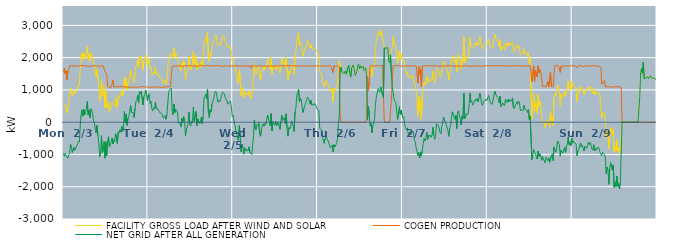
| Category | FACILITY GROSS LOAD AFTER WIND AND SOLAR | COGEN PRODUCTION | NET GRID AFTER ALL GENERATION |
|---|---|---|---|
|  Mon  2/3 | 582 | 1542 | -960 |
|  Mon  2/3 | 608 | 1666 | -1058 |
|  Mon  2/3 | 537 | 1499 | -962 |
|  Mon  2/3 | 560 | 1596 | -1036 |
|  Mon  2/3 | 284 | 1313 | -1029 |
|  Mon  2/3 | 470 | 1590 | -1120 |
|  Mon  2/3 | 611 | 1621 | -1010 |
|  Mon  2/3 | 792 | 1746 | -954 |
|  Mon  2/3 | 1065 | 1750 | -685 |
|  Mon  2/3 | 976 | 1751 | -775 |
|  Mon  2/3 | 803 | 1744 | -941 |
|  Mon  2/3 | 784 | 1738 | -954 |
|  Mon  2/3 | 967 | 1743 | -776 |
|  Mon  2/3 | 872 | 1742 | -870 |
|  Mon  2/3 | 852 | 1751 | -899 |
|  Mon  2/3 | 1005 | 1753 | -748 |
|  Mon  2/3 | 1089 | 1761 | -672 |
|  Mon  2/3 | 1149 | 1737 | -588 |
|  Mon  2/3 | 1116 | 1735 | -619 |
|  Mon  2/3 | 1636 | 1748 | -112 |
|  Mon  2/3 | 1988 | 1749 | 239 |
|  Mon  2/3 | 2149 | 1766 | 383 |
|  Mon  2/3 | 1932 | 1747 | 185 |
|  Mon  2/3 | 2146 | 1743 | 403 |
|  Mon  2/3 | 1973 | 1745 | 228 |
|  Mon  2/3 | 2020 | 1755 | 265 |
|  Mon  2/3 | 2032 | 1749 | 283 |
|  Mon  2/3 | 2367 | 1728 | 639 |
|  Mon  2/3 | 1969 | 1748 | 221 |
|  Mon  2/3 | 2095 | 1721 | 374 |
|  Mon  2/3 | 1886 | 1748 | 138 |
|  Mon  2/3 | 2152 | 1738 | 414 |
|  Mon  2/3 | 2106 | 1739 | 367 |
|  Mon  2/3 | 2009 | 1746 | 263 |
|  Mon  2/3 | 1796 | 1754 | 42 |
|  Mon  2/3 | 1732 | 1746 | -14 |
|  Mon  2/3 | 1529 | 1749 | -220 |
|  Mon  2/3 | 1406 | 1738 | -332 |
|  Mon  2/3 | 1636 | 1731 | -95 |
|  Mon  2/3 | 1338 | 1750 | -412 |
|  Mon  2/3 | 1110 | 1753 | -643 |
|  Mon  2/3 | 654 | 1725 | -1071 |
|  Mon  2/3 | 745 | 1749 | -1004 |
|  Mon  2/3 | 1324 | 1741 | -417 |
|  Mon  2/3 | 787 | 1732 | -945 |
|  Mon  2/3 | 855 | 1748 | -893 |
|  Mon  2/3 | 1140 | 1744 | -604 |
|  Mon  2/3 | 454 | 1570 | -1116 |
|  Mon  2/3 | 945 | 1550 | -605 |
|  Mon  2/3 | 453 | 1487 | -1034 |
|  Mon  2/3 | 524 | 1106 | -582 |
|  Mon  2/3 | 634 | 1085 | -451 |
|  Mon  2/3 | 322 | 1081 | -759 |
|  Mon  2/3 | 429 | 1099 | -670 |
|  Mon  2/3 | 454 | 1087 | -633 |
|  Mon  2/3 | 618 | 1105 | -487 |
|  Mon  2/3 | 623 | 1300 | -677 |
|  Mon  2/3 | 551 | 1096 | -545 |
|  Mon  2/3 | 500 | 1096 | -596 |
|  Mon  2/3 | 739 | 1096 | -357 |
|  Mon  2/3 | 755 | 1088 | -333 |
|  Mon  2/3 | 440 | 1098 | -658 |
|  Mon  2/3 | 799 | 1096 | -297 |
|  Mon  2/3 | 766 | 1094 | -328 |
|  Mon  2/3 | 857 | 1089 | -232 |
|  Mon  2/3 | 805 | 1117 | -312 |
|  Mon  2/3 | 966 | 1102 | -136 |
|  Mon  2/3 | 818 | 1099 | -281 |
|  Mon  2/3 | 983 | 1097 | -114 |
|  Mon  2/3 | 1416 | 1087 | 329 |
|  Mon  2/3 | 1065 | 1092 | -27 |
|  Mon  2/3 | 1349 | 1094 | 255 |
|  Mon  2/3 | 993 | 1092 | -99 |
|  Mon  2/3 | 1214 | 1085 | 129 |
|  Mon  2/3 | 1265 | 1094 | 171 |
|  Mon  2/3 | 1433 | 1080 | 353 |
|  Mon  2/3 | 1616 | 1098 | 518 |
|  Mon  2/3 | 1393 | 1093 | 300 |
|  Mon  2/3 | 1417 | 1100 | 317 |
|  Mon  2/3 | 1380 | 1088 | 292 |
|  Mon  2/3 | 1232 | 1090 | 142 |
|  Mon  2/3 | 1530 | 1091 | 439 |
|  Mon  2/3 | 1741 | 1094 | 647 |
|  Mon  2/3 | 1772 | 1078 | 694 |
|  Mon  2/3 | 1916 | 1091 | 825 |
|  Mon  2/3 | 1691 | 1092 | 599 |
|  Mon  2/3 | 2023 | 1082 | 941 |
|  Mon  2/3 | 1976 | 1099 | 877 |
|  Mon  2/3 | 2057 | 1097 | 960 |
|  Mon  2/3 | 2044 | 1099 | 945 |
|  Mon  2/3 | 1616 | 1080 | 536 |
|  Mon  2/3 | 1880 | 1092 | 788 |
|  Mon  2/3 | 1941 | 1092 | 849 |
|  Mon  2/3 | 2083 | 1092 | 991 |
|  Mon  2/3 | 1956 | 1088 | 868 |
|  Mon  2/3 | 1747 | 1089 | 658 |
|  Tue  2/4 | 1925 | 1088 | 837 |
|  Tue  2/4 | 1968 | 1091 | 877 |
|  Tue  2/4 | 1664 | 1083 | 581 |
|  Tue  2/4 | 1718 | 1076 | 642 |
|  Tue  2/4 | 1518 | 1094 | 424 |
|  Tue  2/4 | 1441 | 1092 | 349 |
|  Tue  2/4 | 1550 | 1100 | 450 |
|  Tue  2/4 | 1499 | 1091 | 408 |
|  Tue  2/4 | 1705 | 1092 | 613 |
|  Tue  2/4 | 1501 | 1087 | 414 |
|  Tue  2/4 | 1476 | 1082 | 394 |
|  Tue  2/4 | 1509 | 1099 | 410 |
|  Tue  2/4 | 1439 | 1096 | 343 |
|  Tue  2/4 | 1375 | 1080 | 295 |
|  Tue  2/4 | 1389 | 1081 | 308 |
|  Tue  2/4 | 1353 | 1076 | 277 |
|  Tue  2/4 | 1330 | 1100 | 230 |
|  Tue  2/4 | 1212 | 1087 | 125 |
|  Tue  2/4 | 1262 | 1098 | 164 |
|  Tue  2/4 | 1300 | 1095 | 205 |
|  Tue  2/4 | 1177 | 1089 | 88 |
|  Tue  2/4 | 1324 | 1095 | 229 |
|  Tue  2/4 | 1654 | 1094 | 560 |
|  Tue  2/4 | 2014 | 1097 | 917 |
|  Tue  2/4 | 2090 | 1096 | 994 |
|  Tue  2/4 | 2113 | 1098 | 1015 |
|  Tue  2/4 | 2144 | 1093 | 1051 |
|  Tue  2/4 | 2065 | 1726 | 339 |
|  Tue  2/4 | 1963 | 1732 | 231 |
|  Tue  2/4 | 2304 | 1742 | 562 |
|  Tue  2/4 | 2033 | 1736 | 297 |
|  Tue  2/4 | 2136 | 1739 | 397 |
|  Tue  2/4 | 2161 | 1756 | 405 |
|  Tue  2/4 | 2056 | 1739 | 317 |
|  Tue  2/4 | 1730 | 1749 | -19 |
|  Tue  2/4 | 1724 | 1750 | -26 |
|  Tue  2/4 | 1713 | 1738 | -25 |
|  Tue  2/4 | 1590 | 1742 | -152 |
|  Tue  2/4 | 1853 | 1737 | 116 |
|  Tue  2/4 | 1710 | 1731 | -21 |
|  Tue  2/4 | 1915 | 1745 | 170 |
|  Tue  2/4 | 1843 | 1740 | 103 |
|  Tue  2/4 | 1316 | 1735 | -419 |
|  Tue  2/4 | 1536 | 1754 | -218 |
|  Tue  2/4 | 1569 | 1735 | -166 |
|  Tue  2/4 | 1700 | 1736 | -36 |
|  Tue  2/4 | 2050 | 1737 | 313 |
|  Tue  2/4 | 1705 | 1757 | -52 |
|  Tue  2/4 | 1626 | 1737 | -111 |
|  Tue  2/4 | 1771 | 1740 | 31 |
|  Tue  2/4 | 1714 | 1736 | -22 |
|  Tue  2/4 | 2200 | 1738 | 462 |
|  Tue  2/4 | 1755 | 1745 | 10 |
|  Tue  2/4 | 1891 | 1751 | 140 |
|  Tue  2/4 | 2070 | 1736 | 334 |
|  Tue  2/4 | 1618 | 1732 | -114 |
|  Tue  2/4 | 1827 | 1725 | 102 |
|  Tue  2/4 | 1856 | 1739 | 117 |
|  Tue  2/4 | 1697 | 1733 | -36 |
|  Tue  2/4 | 1787 | 1766 | 21 |
|  Tue  2/4 | 1901 | 1748 | 153 |
|  Tue  2/4 | 1699 | 1745 | -46 |
|  Tue  2/4 | 1925 | 1748 | 177 |
|  Tue  2/4 | 2486 | 1742 | 744 |
|  Tue  2/4 | 2536 | 1738 | 798 |
|  Tue  2/4 | 2608 | 1745 | 863 |
|  Tue  2/4 | 2470 | 1753 | 717 |
|  Tue  2/4 | 2790 | 1764 | 1026 |
|  Tue  2/4 | 2040 | 1735 | 305 |
|  Tue  2/4 | 1886 | 1742 | 144 |
|  Tue  2/4 | 2127 | 1736 | 391 |
|  Tue  2/4 | 2072 | 1755 | 317 |
|  Tue  2/4 | 2311 | 1749 | 562 |
|  Tue  2/4 | 2295 | 1743 | 552 |
|  Tue  2/4 | 2493 | 1755 | 738 |
|  Tue  2/4 | 2603 | 1737 | 866 |
|  Tue  2/4 | 2707 | 1742 | 965 |
|  Tue  2/4 | 2665 | 1753 | 912 |
|  Tue  2/4 | 2447 | 1732 | 715 |
|  Tue  2/4 | 2370 | 1753 | 617 |
|  Tue  2/4 | 2428 | 1746 | 682 |
|  Tue  2/4 | 2387 | 1747 | 640 |
|  Tue  2/4 | 2475 | 1739 | 736 |
|  Tue  2/4 | 2435 | 1728 | 707 |
|  Tue  2/4 | 2673 | 1745 | 928 |
|  Tue  2/4 | 2692 | 1741 | 951 |
|  Tue  2/4 | 2632 | 1749 | 883 |
|  Tue  2/4 | 2509 | 1742 | 767 |
|  Tue  2/4 | 2504 | 1741 | 763 |
|  Tue  2/4 | 2393 | 1739 | 654 |
|  Tue  2/4 | 2304 | 1746 | 558 |
|  Tue  2/4 | 2279 | 1746 | 533 |
|  Tue  2/4 | 2365 | 1738 | 627 |
|  Tue  2/4 | 2393 | 1733 | 660 |
|  Tue  2/4 | 2221 | 1753 | 468 |
|  Tue  2/4 | 1912 | 1745 | 167 |
|  Wed  2/5 | 1946 | 1737 | 209 |
|  Wed  2/5 | 1918 | 1738 | 180 |
|  Wed  2/5 | 1654 | 1747 | -93 |
|  Wed  2/5 | 1668 | 1754 | -86 |
|  Wed  2/5 | 1382 | 1739 | -357 |
|  Wed  2/5 | 1250 | 1745 | -495 |
|  Wed  2/5 | 1191 | 1750 | -559 |
|  Wed  2/5 | 1637 | 1745 | -108 |
|  Wed  2/5 | 1300 | 1744 | -444 |
|  Wed  2/5 | 822 | 1741 | -919 |
|  Wed  2/5 | 1075 | 1758 | -683 |
|  Wed  2/5 | 965 | 1736 | -771 |
|  Wed  2/5 | 759 | 1750 | -991 |
|  Wed  2/5 | 951 | 1744 | -793 |
|  Wed  2/5 | 943 | 1747 | -804 |
|  Wed  2/5 | 838 | 1739 | -901 |
|  Wed  2/5 | 907 | 1743 | -836 |
|  Wed  2/5 | 849 | 1738 | -889 |
|  Wed  2/5 | 971 | 1731 | -760 |
|  Wed  2/5 | 803 | 1752 | -949 |
|  Wed  2/5 | 717 | 1670 | -953 |
|  Wed  2/5 | 745 | 1753 | -1008 |
|  Wed  2/5 | 1006 | 1745 | -739 |
|  Wed  2/5 | 1336 | 1745 | -409 |
|  Wed  2/5 | 1816 | 1746 | 70 |
|  Wed  2/5 | 1542 | 1750 | -208 |
|  Wed  2/5 | 1489 | 1731 | -242 |
|  Wed  2/5 | 1673 | 1739 | -66 |
|  Wed  2/5 | 1647 | 1754 | -107 |
|  Wed  2/5 | 1725 | 1743 | -18 |
|  Wed  2/5 | 1390 | 1742 | -352 |
|  Wed  2/5 | 1313 | 1750 | -437 |
|  Wed  2/5 | 1524 | 1743 | -219 |
|  Wed  2/5 | 1649 | 1735 | -86 |
|  Wed  2/5 | 1712 | 1762 | -50 |
|  Wed  2/5 | 1607 | 1740 | -133 |
|  Wed  2/5 | 1738 | 1754 | -16 |
|  Wed  2/5 | 1665 | 1738 | -73 |
|  Wed  2/5 | 1644 | 1746 | -102 |
|  Wed  2/5 | 1948 | 1730 | 218 |
|  Wed  2/5 | 1837 | 1738 | 99 |
|  Wed  2/5 | 1809 | 1736 | 73 |
|  Wed  2/5 | 1631 | 1743 | -112 |
|  Wed  2/5 | 2015 | 1748 | 267 |
|  Wed  2/5 | 1467 | 1739 | -272 |
|  Wed  2/5 | 1747 | 1728 | 19 |
|  Wed  2/5 | 1740 | 1747 | -7 |
|  Wed  2/5 | 1644 | 1735 | -91 |
|  Wed  2/5 | 1769 | 1747 | 22 |
|  Wed  2/5 | 1632 | 1747 | -115 |
|  Wed  2/5 | 1662 | 1740 | -78 |
|  Wed  2/5 | 1753 | 1743 | 10 |
|  Wed  2/5 | 1646 | 1759 | -113 |
|  Wed  2/5 | 1525 | 1748 | -223 |
|  Wed  2/5 | 1769 | 1742 | 27 |
|  Wed  2/5 | 1969 | 1751 | 218 |
|  Wed  2/5 | 1805 | 1752 | 53 |
|  Wed  2/5 | 1845 | 1737 | 108 |
|  Wed  2/5 | 1899 | 1754 | 145 |
|  Wed  2/5 | 1703 | 1742 | -39 |
|  Wed  2/5 | 2012 | 1750 | 262 |
|  Wed  2/5 | 1551 | 1755 | -204 |
|  Wed  2/5 | 1306 | 1741 | -435 |
|  Wed  2/5 | 1585 | 1748 | -163 |
|  Wed  2/5 | 1508 | 1725 | -217 |
|  Wed  2/5 | 1603 | 1752 | -149 |
|  Wed  2/5 | 1793 | 1750 | 43 |
|  Wed  2/5 | 1736 | 1741 | -5 |
|  Wed  2/5 | 1770 | 1748 | 22 |
|  Wed  2/5 | 1465 | 1753 | -288 |
|  Wed  2/5 | 2057 | 1731 | 326 |
|  Wed  2/5 | 2186 | 1736 | 450 |
|  Wed  2/5 | 2579 | 1754 | 825 |
|  Wed  2/5 | 2635 | 1732 | 903 |
|  Wed  2/5 | 2776 | 1752 | 1024 |
|  Wed  2/5 | 2382 | 1746 | 636 |
|  Wed  2/5 | 2477 | 1738 | 739 |
|  Wed  2/5 | 2444 | 1750 | 694 |
|  Wed  2/5 | 2425 | 1750 | 675 |
|  Wed  2/5 | 2039 | 1738 | 301 |
|  Wed  2/5 | 2152 | 1740 | 412 |
|  Wed  2/5 | 2270 | 1750 | 520 |
|  Wed  2/5 | 2330 | 1746 | 584 |
|  Wed  2/5 | 2402 | 1736 | 666 |
|  Wed  2/5 | 2529 | 1748 | 781 |
|  Wed  2/5 | 2555 | 1746 | 809 |
|  Wed  2/5 | 2414 | 1729 | 685 |
|  Wed  2/5 | 2294 | 1735 | 559 |
|  Wed  2/5 | 2405 | 1732 | 673 |
|  Wed  2/5 | 2293 | 1757 | 536 |
|  Wed  2/5 | 2253 | 1732 | 521 |
|  Wed  2/5 | 2268 | 1740 | 528 |
|  Wed  2/5 | 2304 | 1724 | 580 |
|  Wed  2/5 | 2334 | 1738 | 596 |
|  Wed  2/5 | 2242 | 1752 | 490 |
|  Wed  2/5 | 2156 | 1745 | 411 |
|  Thu  2/6 | 2158 | 1741 | 417 |
|  Thu  2/6 | 2085 | 1743 | 342 |
|  Thu  2/6 | 1562 | 1759 | -197 |
|  Thu  2/6 | 1548 | 1745 | -197 |
|  Thu  2/6 | 1508 | 1746 | -238 |
|  Thu  2/6 | 1271 | 1739 | -468 |
|  Thu  2/6 | 1287 | 1731 | -444 |
|  Thu  2/6 | 1088 | 1743 | -655 |
|  Thu  2/6 | 1221 | 1743 | -522 |
|  Thu  2/6 | 1288 | 1741 | -453 |
|  Thu  2/6 | 1242 | 1736 | -494 |
|  Thu  2/6 | 1223 | 1736 | -513 |
|  Thu  2/6 | 1131 | 1743 | -612 |
|  Thu  2/6 | 1037 | 1756 | -719 |
|  Thu  2/6 | 954 | 1746 | -792 |
|  Thu  2/6 | 947 | 1735 | -788 |
|  Thu  2/6 | 1034 | 1740 | -706 |
|  Thu  2/6 | 615 | 1538 | -923 |
|  Thu  2/6 | 1049 | 1747 | -698 |
|  Thu  2/6 | 965 | 1735 | -770 |
|  Thu  2/6 | 981 | 1731 | -750 |
|  Thu  2/6 | 1072 | 1733 | -661 |
|  Thu  2/6 | 1225 | 1747 | -522 |
|  Thu  2/6 | 1670 | 1746 | -76 |
|  Thu  2/6 | 1900 | 1730 | 170 |
|  Thu  2/6 | 1796 | 214 | 1582 |
|  Thu  2/6 | 1700 | 0 | 1700 |
|  Thu  2/6 | 1554 | 0 | 1554 |
|  Thu  2/6 | 1578 | 0 | 1578 |
|  Thu  2/6 | 1492 | 0 | 1492 |
|  Thu  2/6 | 1483 | 0 | 1483 |
|  Thu  2/6 | 1589 | 0 | 1589 |
|  Thu  2/6 | 1481 | 0 | 1481 |
|  Thu  2/6 | 1471 | 0 | 1471 |
|  Thu  2/6 | 1712 | 0 | 1712 |
|  Thu  2/6 | 1770 | 0 | 1770 |
|  Thu  2/6 | 1490 | 0 | 1490 |
|  Thu  2/6 | 1396 | 0 | 1396 |
|  Thu  2/6 | 1676 | 0 | 1676 |
|  Thu  2/6 | 1652 | 0 | 1652 |
|  Thu  2/6 | 1776 | 0 | 1776 |
|  Thu  2/6 | 1636 | 0 | 1636 |
|  Thu  2/6 | 1448 | 0 | 1448 |
|  Thu  2/6 | 1474 | 0 | 1474 |
|  Thu  2/6 | 1562 | 0 | 1562 |
|  Thu  2/6 | 1750 | 0 | 1750 |
|  Thu  2/6 | 1802 | 0 | 1802 |
|  Thu  2/6 | 1648 | 0 | 1648 |
|  Thu  2/6 | 1748 | 0 | 1748 |
|  Thu  2/6 | 1685 | 0 | 1685 |
|  Thu  2/6 | 1697 | 0 | 1697 |
|  Thu  2/6 | 1730 | 0 | 1730 |
|  Thu  2/6 | 1598 | 0 | 1598 |
|  Thu  2/6 | 1633 | 0 | 1633 |
|  Thu  2/6 | 1687 | 0 | 1687 |
|  Thu  2/6 | 1596 | 148 | 1448 |
|  Thu  2/6 | 1495 | 1430 | 65 |
|  Thu  2/6 | 1478 | 985 | 493 |
|  Thu  2/6 | 1444 | 1250 | 194 |
|  Thu  2/6 | 1633 | 1739 | -106 |
|  Thu  2/6 | 1717 | 1751 | -34 |
|  Thu  2/6 | 1416 | 1748 | -332 |
|  Thu  2/6 | 1642 | 1750 | -108 |
|  Thu  2/6 | 1707 | 1742 | -35 |
|  Thu  2/6 | 1892 | 1765 | 127 |
|  Thu  2/6 | 2318 | 1742 | 576 |
|  Thu  2/6 | 2518 | 1748 | 770 |
|  Thu  2/6 | 2534 | 1754 | 780 |
|  Thu  2/6 | 2806 | 1764 | 1042 |
|  Thu  2/6 | 2769 | 1739 | 1030 |
|  Thu  2/6 | 2669 | 1741 | 928 |
|  Thu  2/6 | 2846 | 1754 | 1092 |
|  Thu  2/6 | 2831 | 1727 | 1104 |
|  Thu  2/6 | 2606 | 1758 | 848 |
|  Thu  2/6 | 2486 | 1734 | 752 |
|  Thu  2/6 | 2300 | 0 | 2300 |
|  Thu  2/6 | 2300 | 0 | 2300 |
|  Thu  2/6 | 2300 | 0 | 2300 |
|  Thu  2/6 | 2300 | 0 | 2300 |
|  Thu  2/6 | 2300 | 0 | 2300 |
|  Thu  2/6 | 1896 | 0 | 1896 |
|  Thu  2/6 | 1846 | 0 | 1846 |
|  Thu  2/6 | 2089 | 0 | 2089 |
|  Thu  2/6 | 2208 | 691 | 1517 |
|  Thu  2/6 | 2321 | 1241 | 1080 |
|  Thu  2/6 | 2663 | 1746 | 917 |
|  Thu  2/6 | 2427 | 1731 | 696 |
|  Thu  2/6 | 2423 | 1751 | 672 |
|  Thu  2/6 | 2345 | 1738 | 607 |
|  Thu  2/6 | 2117 | 1748 | 369 |
|  Thu  2/6 | 1824 | 1738 | 86 |
|  Thu  2/6 | 2011 | 1760 | 251 |
|  Thu  2/6 | 2215 | 1735 | 480 |
|  Thu  2/6 | 1997 | 1749 | 248 |
|  Thu  2/6 | 2116 | 1743 | 373 |
|  Thu  2/6 | 1964 | 1734 | 230 |
|  Fri  2/7 | 1870 | 1738 | 132 |
|  Fri  2/7 | 1913 | 1743 | 170 |
|  Fri  2/7 | 1679 | 1754 | -75 |
|  Fri  2/7 | 1572 | 1736 | -164 |
|  Fri  2/7 | 1501 | 1737 | -236 |
|  Fri  2/7 | 1568 | 1746 | -178 |
|  Fri  2/7 | 1380 | 1734 | -354 |
|  Fri  2/7 | 1407 | 1748 | -341 |
|  Fri  2/7 | 1445 | 1758 | -313 |
|  Fri  2/7 | 1353 | 1744 | -391 |
|  Fri  2/7 | 1421 | 1737 | -316 |
|  Fri  2/7 | 1446 | 1746 | -300 |
|  Fri  2/7 | 1442 | 1742 | -300 |
|  Fri  2/7 | 1183 | 1738 | -555 |
|  Fri  2/7 | 1143 | 1748 | -605 |
|  Fri  2/7 | 964 | 1753 | -789 |
|  Fri  2/7 | 953 | 1748 | -795 |
|  Fri  2/7 | 179 | 1210 | -1031 |
|  Fri  2/7 | 797 | 1735 | -938 |
|  Fri  2/7 | 372 | 1482 | -1110 |
|  Fri  2/7 | 688 | 1633 | -945 |
|  Fri  2/7 | 61 | 1091 | -1030 |
|  Fri  2/7 | 862 | 1741 | -879 |
|  Fri  2/7 | 1071 | 1741 | -670 |
|  Fri  2/7 | 1247 | 1752 | -505 |
|  Fri  2/7 | 1155 | 1736 | -581 |
|  Fri  2/7 | 1248 | 1754 | -506 |
|  Fri  2/7 | 1430 | 1743 | -313 |
|  Fri  2/7 | 1214 | 1746 | -532 |
|  Fri  2/7 | 1344 | 1747 | -403 |
|  Fri  2/7 | 1308 | 1746 | -438 |
|  Fri  2/7 | 1336 | 1735 | -399 |
|  Fri  2/7 | 1278 | 1747 | -469 |
|  Fri  2/7 | 1348 | 1751 | -403 |
|  Fri  2/7 | 1584 | 1740 | -156 |
|  Fri  2/7 | 1345 | 1754 | -409 |
|  Fri  2/7 | 1222 | 1752 | -530 |
|  Fri  2/7 | 1299 | 1744 | -445 |
|  Fri  2/7 | 1688 | 1735 | -47 |
|  Fri  2/7 | 1689 | 1757 | -68 |
|  Fri  2/7 | 1626 | 1733 | -107 |
|  Fri  2/7 | 1547 | 1730 | -183 |
|  Fri  2/7 | 1421 | 1740 | -319 |
|  Fri  2/7 | 1382 | 1746 | -364 |
|  Fri  2/7 | 1589 | 1736 | -147 |
|  Fri  2/7 | 1728 | 1742 | -14 |
|  Fri  2/7 | 1898 | 1742 | 156 |
|  Fri  2/7 | 1800 | 1730 | 70 |
|  Fri  2/7 | 1783 | 1729 | 54 |
|  Fri  2/7 | 1681 | 1747 | -66 |
|  Fri  2/7 | 1660 | 1754 | -94 |
|  Fri  2/7 | 1484 | 1745 | -261 |
|  Fri  2/7 | 1316 | 1755 | -439 |
|  Fri  2/7 | 1569 | 1749 | -180 |
|  Fri  2/7 | 1643 | 1747 | -104 |
|  Fri  2/7 | 1863 | 1744 | 119 |
|  Fri  2/7 | 2062 | 1741 | 321 |
|  Fri  2/7 | 1986 | 1742 | 244 |
|  Fri  2/7 | 1987 | 1733 | 254 |
|  Fri  2/7 | 1835 | 1751 | 84 |
|  Fri  2/7 | 1951 | 1740 | 211 |
|  Fri  2/7 | 1556 | 1753 | -197 |
|  Fri  2/7 | 2060 | 1744 | 316 |
|  Fri  2/7 | 2101 | 1745 | 356 |
|  Fri  2/7 | 1982 | 1747 | 235 |
|  Fri  2/7 | 1830 | 1754 | 76 |
|  Fri  2/7 | 1643 | 1730 | -87 |
|  Fri  2/7 | 1945 | 1755 | 190 |
|  Fri  2/7 | 1842 | 1741 | 101 |
|  Fri  2/7 | 2644 | 1746 | 898 |
|  Fri  2/7 | 1854 | 1742 | 112 |
|  Fri  2/7 | 1914 | 1746 | 168 |
|  Fri  2/7 | 2029 | 1756 | 273 |
|  Fri  2/7 | 1966 | 1741 | 225 |
|  Fri  2/7 | 2030 | 1743 | 287 |
|  Fri  2/7 | 2327 | 1753 | 574 |
|  Fri  2/7 | 2633 | 1734 | 899 |
|  Fri  2/7 | 2361 | 1744 | 617 |
|  Fri  2/7 | 2390 | 1736 | 654 |
|  Fri  2/7 | 2281 | 1754 | 527 |
|  Fri  2/7 | 2304 | 1735 | 569 |
|  Fri  2/7 | 2337 | 1744 | 593 |
|  Fri  2/7 | 2446 | 1742 | 704 |
|  Fri  2/7 | 2388 | 1729 | 659 |
|  Fri  2/7 | 2477 | 1739 | 738 |
|  Fri  2/7 | 2364 | 1738 | 626 |
|  Fri  2/7 | 2446 | 1737 | 709 |
|  Fri  2/7 | 2651 | 1747 | 904 |
|  Fri  2/7 | 2512 | 1736 | 776 |
|  Fri  2/7 | 2328 | 1748 | 580 |
|  Fri  2/7 | 2261 | 1736 | 525 |
|  Fri  2/7 | 2376 | 1745 | 631 |
|  Fri  2/7 | 2373 | 1754 | 619 |
|  Fri  2/7 | 2406 | 1737 | 669 |
|  Fri  2/7 | 2466 | 1749 | 717 |
|  Fri  2/7 | 2423 | 1752 | 671 |
|  Sat  2/8 | 2420 | 1740 | 680 |
|  Sat  2/8 | 2575 | 1745 | 830 |
|  Sat  2/8 | 2559 | 1749 | 810 |
|  Sat  2/8 | 2330 | 1738 | 592 |
|  Sat  2/8 | 2323 | 1754 | 569 |
|  Sat  2/8 | 2289 | 1735 | 554 |
|  Sat  2/8 | 2419 | 1734 | 685 |
|  Sat  2/8 | 2398 | 1725 | 673 |
|  Sat  2/8 | 2712 | 1753 | 959 |
|  Sat  2/8 | 2624 | 1757 | 867 |
|  Sat  2/8 | 2564 | 1751 | 813 |
|  Sat  2/8 | 2536 | 1738 | 798 |
|  Sat  2/8 | 2478 | 1742 | 736 |
|  Sat  2/8 | 2331 | 1731 | 600 |
|  Sat  2/8 | 2556 | 1752 | 804 |
|  Sat  2/8 | 2231 | 1748 | 483 |
|  Sat  2/8 | 2251 | 1751 | 500 |
|  Sat  2/8 | 2352 | 1757 | 595 |
|  Sat  2/8 | 2309 | 1743 | 566 |
|  Sat  2/8 | 2243 | 1742 | 501 |
|  Sat  2/8 | 2449 | 1743 | 706 |
|  Sat  2/8 | 2377 | 1738 | 639 |
|  Sat  2/8 | 2341 | 1736 | 605 |
|  Sat  2/8 | 2479 | 1763 | 716 |
|  Sat  2/8 | 2367 | 1741 | 626 |
|  Sat  2/8 | 2447 | 1749 | 698 |
|  Sat  2/8 | 2399 | 1756 | 643 |
|  Sat  2/8 | 2425 | 1738 | 687 |
|  Sat  2/8 | 2491 | 1737 | 754 |
|  Sat  2/8 | 2227 | 1757 | 470 |
|  Sat  2/8 | 2163 | 1745 | 418 |
|  Sat  2/8 | 2170 | 1735 | 435 |
|  Sat  2/8 | 2319 | 1750 | 569 |
|  Sat  2/8 | 2384 | 1749 | 635 |
|  Sat  2/8 | 2292 | 1739 | 553 |
|  Sat  2/8 | 2370 | 1722 | 648 |
|  Sat  2/8 | 2331 | 1756 | 575 |
|  Sat  2/8 | 2086 | 1737 | 349 |
|  Sat  2/8 | 2125 | 1742 | 383 |
|  Sat  2/8 | 2130 | 1752 | 378 |
|  Sat  2/8 | 2106 | 1750 | 356 |
|  Sat  2/8 | 2272 | 1750 | 522 |
|  Sat  2/8 | 2147 | 1733 | 414 |
|  Sat  2/8 | 2179 | 1754 | 425 |
|  Sat  2/8 | 2114 | 1747 | 367 |
|  Sat  2/8 | 2034 | 1736 | 298 |
|  Sat  2/8 | 2145 | 1740 | 405 |
|  Sat  2/8 | 1825 | 1734 | 91 |
|  Sat  2/8 | 1946 | 1757 | 189 |
|  Sat  2/8 | 1953 | 1740 | 213 |
|  Sat  2/8 | 100 | 1262 | -1162 |
|  Sat  2/8 | 588 | 1580 | -992 |
|  Sat  2/8 | 898 | 1745 | -847 |
|  Sat  2/8 | 333 | 1255 | -922 |
|  Sat  2/8 | 622 | 1596 | -974 |
|  Sat  2/8 | 499 | 1569 | -1070 |
|  Sat  2/8 | 263 | 1406 | -1143 |
|  Sat  2/8 | 858 | 1750 | -892 |
|  Sat  2/8 | 470 | 1533 | -1063 |
|  Sat  2/8 | 655 | 1637 | -982 |
|  Sat  2/8 | 515 | 1541 | -1026 |
|  Sat  2/8 | 189 | 1372 | -1183 |
|  Sat  2/8 | 33 | 1105 | -1072 |
|  Sat  2/8 | -32 | 1105 | -1137 |
|  Sat  2/8 | 2 | 1110 | -1108 |
|  Sat  2/8 | -164 | 1096 | -1260 |
|  Sat  2/8 | 9 | 1090 | -1081 |
|  Sat  2/8 | 3 | 1098 | -1095 |
|  Sat  2/8 | 64 | 1257 | -1193 |
|  Sat  2/8 | -16 | 1091 | -1107 |
|  Sat  2/8 | -155 | 1088 | -1243 |
|  Sat  2/8 | 333 | 1554 | -1221 |
|  Sat  2/8 | 58 | 1099 | -1041 |
|  Sat  2/8 | 143 | 1128 | -985 |
|  Sat  2/8 | -101 | 1093 | -1194 |
|  Sat  2/8 | 738 | 1505 | -767 |
|  Sat  2/8 | 889 | 1753 | -864 |
|  Sat  2/8 | 814 | 1744 | -930 |
|  Sat  2/8 | 924 | 1757 | -833 |
|  Sat  2/8 | 1162 | 1743 | -581 |
|  Sat  2/8 | 1089 | 1748 | -659 |
|  Sat  2/8 | 1043 | 1734 | -691 |
|  Sat  2/8 | 488 | 1540 | -1052 |
|  Sat  2/8 | 875 | 1734 | -859 |
|  Sat  2/8 | 890 | 1741 | -851 |
|  Sat  2/8 | 770 | 1729 | -959 |
|  Sat  2/8 | 800 | 1746 | -946 |
|  Sat  2/8 | 958 | 1742 | -784 |
|  Sat  2/8 | 804 | 1733 | -929 |
|  Sat  2/8 | 992 | 1743 | -751 |
|  Sat  2/8 | 1045 | 1744 | -699 |
|  Sat  2/8 | 1283 | 1746 | -463 |
|  Sat  2/8 | 1040 | 1734 | -694 |
|  Sat  2/8 | 1118 | 1742 | -624 |
|  Sat  2/8 | 984 | 1724 | -740 |
|  Sat  2/8 | 1263 | 1752 | -489 |
|  Sun  2/9 | 1103 | 1753 | -650 |
|  Sun  2/9 | 1159 | 1749 | -590 |
|  Sun  2/9 | 1103 | 1749 | -646 |
|  Sun  2/9 | 1089 | 1738 | -649 |
|  Sun  2/9 | 1077 | 1751 | -674 |
|  Sun  2/9 | 639 | 1678 | -1039 |
|  Sun  2/9 | 850 | 1742 | -892 |
|  Sun  2/9 | 903 | 1755 | -852 |
|  Sun  2/9 | 896 | 1755 | -859 |
|  Sun  2/9 | 1113 | 1757 | -644 |
|  Sun  2/9 | 981 | 1738 | -757 |
|  Sun  2/9 | 1018 | 1737 | -719 |
|  Sun  2/9 | 984 | 1727 | -743 |
|  Sun  2/9 | 843 | 1735 | -892 |
|  Sun  2/9 | 988 | 1737 | -749 |
|  Sun  2/9 | 983 | 1751 | -768 |
|  Sun  2/9 | 943 | 1758 | -815 |
|  Sun  2/9 | 951 | 1753 | -802 |
|  Sun  2/9 | 1119 | 1736 | -617 |
|  Sun  2/9 | 1027 | 1721 | -694 |
|  Sun  2/9 | 1111 | 1738 | -627 |
|  Sun  2/9 | 1022 | 1745 | -723 |
|  Sun  2/9 | 913 | 1749 | -836 |
|  Sun  2/9 | 875 | 1748 | -873 |
|  Sun  2/9 | 1048 | 1745 | -697 |
|  Sun  2/9 | 843 | 1732 | -889 |
|  Sun  2/9 | 935 | 1747 | -812 |
|  Sun  2/9 | 869 | 1733 | -864 |
|  Sun  2/9 | 943 | 1741 | -798 |
|  Sun  2/9 | 957 | 1723 | -766 |
|  Sun  2/9 | 897 | 1725 | -828 |
|  Sun  2/9 | 806 | 1735 | -929 |
|  Sun  2/9 | 783 | 1696 | -913 |
|  Sun  2/9 | 130 | 1171 | -1041 |
|  Sun  2/9 | 286 | 1219 | -933 |
|  Sun  2/9 | 299 | 1215 | -916 |
|  Sun  2/9 | 294 | 1289 | -995 |
|  Sun  2/9 | 23 | 1097 | -1074 |
|  Sun  2/9 | -496 | 1097 | -1593 |
|  Sun  2/9 | -294 | 1097 | -1391 |
|  Sun  2/9 | -372 | 1102 | -1474 |
|  Sun  2/9 | -826 | 1098 | -1924 |
|  Sun  2/9 | -339 | 1099 | -1438 |
|  Sun  2/9 | -161 | 1088 | -1249 |
|  Sun  2/9 | -304 | 1088 | -1392 |
|  Sun  2/9 | -405 | 1084 | -1489 |
|  Sun  2/9 | -225 | 1100 | -1325 |
|  Sun  2/9 | -925 | 1094 | -2019 |
|  Sun  2/9 | -764 | 1091 | -1855 |
|  Sun  2/9 | -895 | 1100 | -1995 |
|  Sun  2/9 | -565 | 1102 | -1667 |
|  Sun  2/9 | -892 | 1094 | -1986 |
|  Sun  2/9 | -789 | 1091 | -1880 |
|  Sun  2/9 | -967 | 1099 | -2066 |
|  Sun  2/9 | -815 | 1085 | -1900 |
|  Sun  2/9 | -815 | 1085 | -1900 |
|  Sun  2/9 | 0 | 0 | 0 |
|  Sun  2/9 | 0 | 0 | 0 |
|  Sun  2/9 | 0 | 0 | 0 |
|  Sun  2/9 | 0 | 0 | 0 |
|  Sun  2/9 | 0 | 0 | 0 |
|  Sun  2/9 | 0 | 0 | 0 |
|  Sun  2/9 | 0 | 0 | 0 |
|  Sun  2/9 | 0 | 0 | 0 |
|  Sun  2/9 | 0 | 0 | 0 |
|  Sun  2/9 | 0 | 0 | 0 |
|  Sun  2/9 | 0 | 0 | 0 |
|  Sun  2/9 | 0 | 0 | 0 |
|  Sun  2/9 | 0 | 0 | 0 |
|  Sun  2/9 | 0 | 0 | 0 |
|  Sun  2/9 | 0 | 0 | 0 |
|  Sun  2/9 | 0 | 0 | 0 |
|  Sun  2/9 | 0 | 0 | 0 |
|  Sun  2/9 | 0 | 0 | 0 |
|  Sun  2/9 | 0 | 0 | 0 |
|  Sun  2/9 | 0 | 0 | 0 |
|  Sun  2/9 | 777 | 0 | 777 |
|  Sun  2/9 | 1543 | 0 | 1543 |
|  Sun  2/9 | 1660 | 0 | 1660 |
|  Sun  2/9 | 1516 | 0 | 1516 |
|  Sun  2/9 | 1865 | 0 | 1865 |
|  Sun  2/9 | 1345 | 0 | 1345 |
|  Sun  2/9 | 1325 | 0 | 1325 |
|  Sun  2/9 | 1368 | 0 | 1368 |
|  Sun  2/9 | 1342 | 0 | 1342 |
|  Sun  2/9 | 1407 | 0 | 1407 |
|  Sun  2/9 | 1345 | 0 | 1345 |
|  Sun  2/9 | 1405 | 0 | 1405 |
|  Sun  2/9 | 1444 | 0 | 1444 |
|  Sun  2/9 | 1383 | 0 | 1383 |
|  Sun  2/9 | 1380 | 0 | 1380 |
|  Sun  2/9 | 1363 | 0 | 1363 |
|  Sun  2/9 | 1380 | 0 | 1380 |
|  Sun  2/9 | 1365 | 0 | 1365 |
|  Sun  2/9 | 1395 | 0 | 1395 |
|  Sun  2/9 | 1297 | 0 | 1297 |